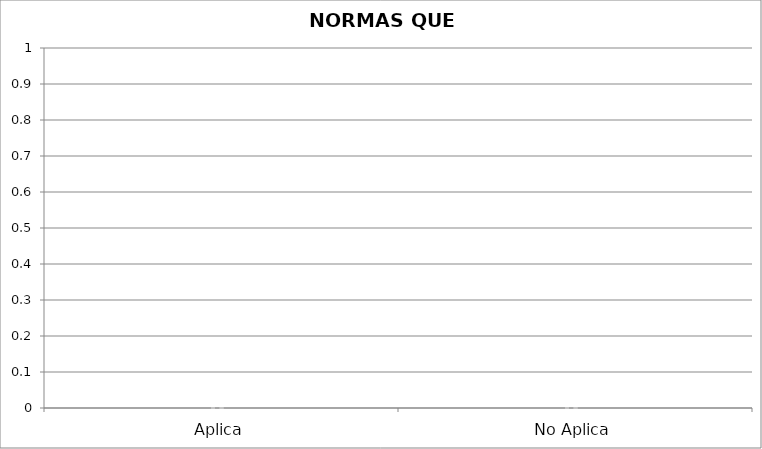
| Category | Series 0 |
|---|---|
| Aplica | 0 |
| No Aplica | 0 |